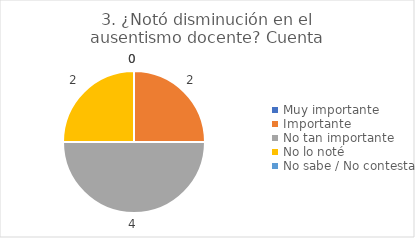
| Category | 3. ¿Notó disminución en el ausentismo docente? |
|---|---|
| Muy importante  | 0 |
| Importante  | 0.25 |
| No tan importante  | 0.5 |
| No lo noté  | 0.25 |
| No sabe / No contesta | 0 |